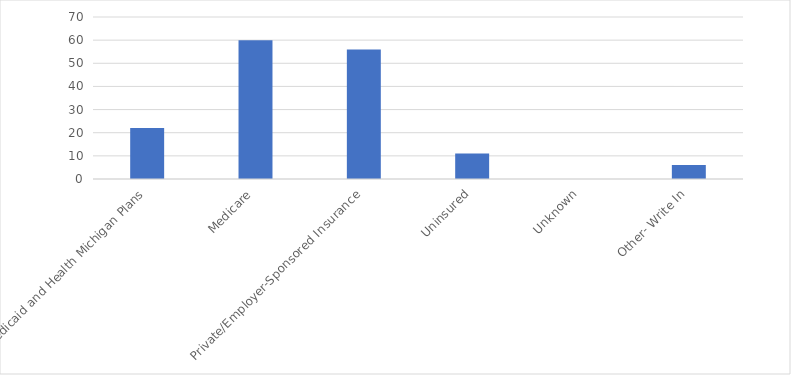
| Category | Number of Responses |
|---|---|
| Medicaid and Health Michigan Plans | 22 |
| Medicare | 60 |
| Private/Employer-Sponsored Insurance | 56 |
| Uninsured | 11 |
| Unknown | 0 |
| Other- Write In | 6 |